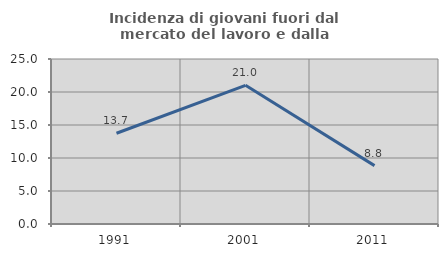
| Category | Incidenza di giovani fuori dal mercato del lavoro e dalla formazione  |
|---|---|
| 1991.0 | 13.747 |
| 2001.0 | 21.008 |
| 2011.0 | 8.845 |